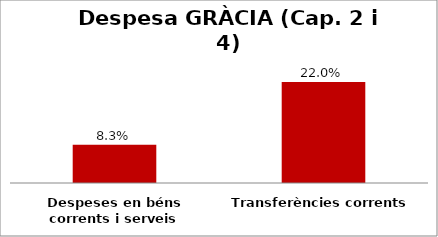
| Category | Series 0 |
|---|---|
| Despeses en béns corrents i serveis | 0.083 |
| Transferències corrents | 0.22 |